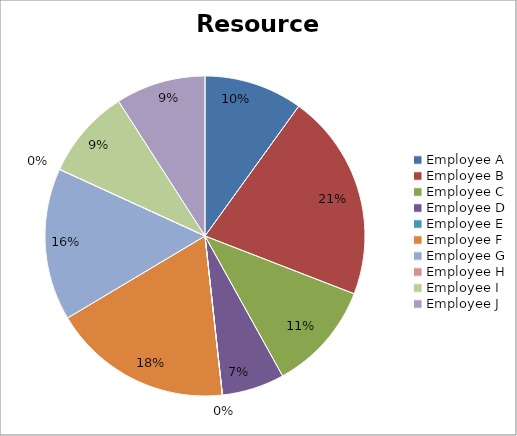
| Category | data |
|---|---|
| Employee A | 1890 |
| Employee B | 3975 |
| Employee C | 2100 |
| Employee D | 1200 |
| Employee E | 0 |
| Employee F | 3450 |
| Employee G | 2925 |
| Employee H | 0 |
| Employee I | 1725 |
| Employee J | 1725 |